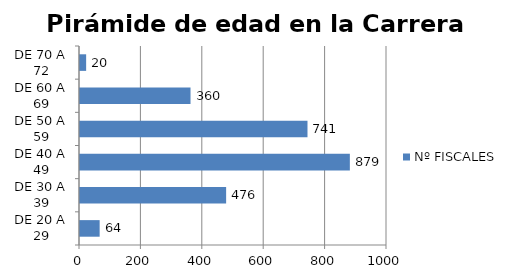
| Category | Nº FISCALES |
|---|---|
| DE 20 A 29 | 64 |
| DE 30 A 39 | 476 |
| DE 40 A 49 | 879 |
| DE 50 A 59 | 741 |
| DE 60 A 69 | 360 |
| DE 70 A 72 | 20 |